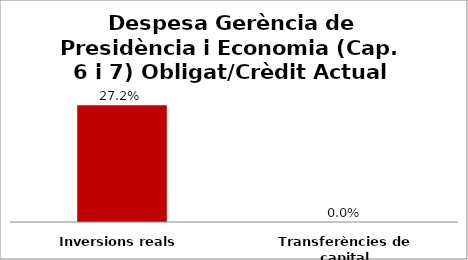
| Category | Series 0 |
|---|---|
| Inversions reals | 0.272 |
| Transferències de capital | 0 |